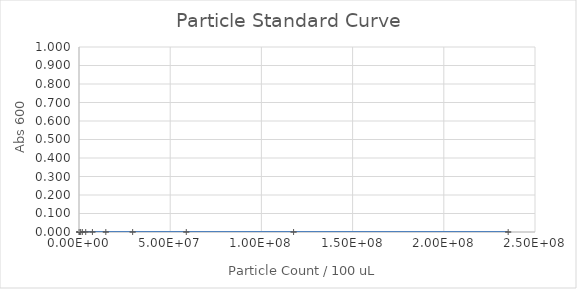
| Category | Series 0 |
|---|---|
| 235294117.64705887 | 0 |
| 117647058.82352944 | 0 |
| 58823529.41176472 | 0 |
| 29411764.70588236 | 0 |
| 14705882.35294118 | 0 |
| 7352941.17647059 | 0 |
| 3676470.588235295 | 0 |
| 1838235.2941176475 | 0 |
| 919117.6470588237 | 0 |
| 459558.82352941186 | 0 |
| 229779.41176470593 | 0 |
| 0.0 | 0 |